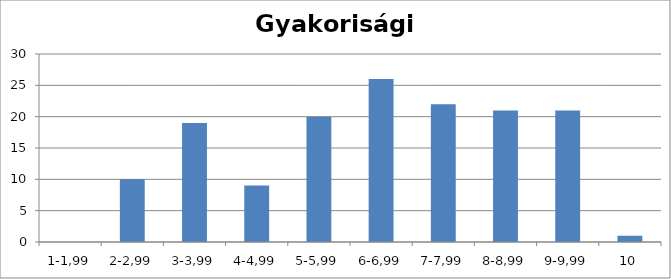
| Category | Series 0 |
|---|---|
| 1-1,99 | 0 |
| 2-2,99 | 10 |
| 3-3,99 | 19 |
| 4-4,99 | 9 |
| 5-5,99 | 20 |
| 6-6,99 | 26 |
| 7-7,99 | 22 |
| 8-8,99 | 21 |
| 9-9,99 | 21 |
| 10 | 1 |